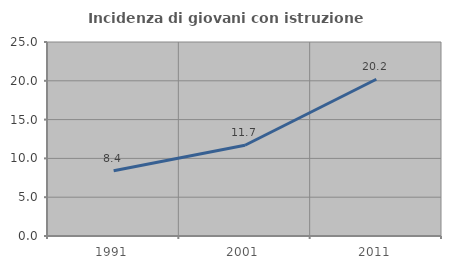
| Category | Incidenza di giovani con istruzione universitaria |
|---|---|
| 1991.0 | 8.411 |
| 2001.0 | 11.694 |
| 2011.0 | 20.202 |